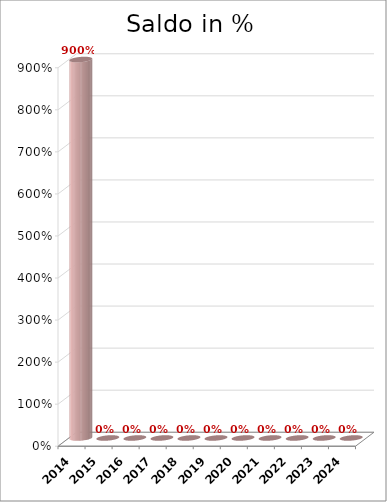
| Category | Saldo in % |
|---|---|
| 2014.0 | 9 |
| 2015.0 | 0 |
| 2016.0 | 0 |
| 2017.0 | 0 |
| 2018.0 | 0 |
| 2019.0 | 0 |
| 2020.0 | 0 |
| 2021.0 | 0 |
| 2022.0 | 0 |
| 2023.0 | 0 |
| 2024.0 | 0 |